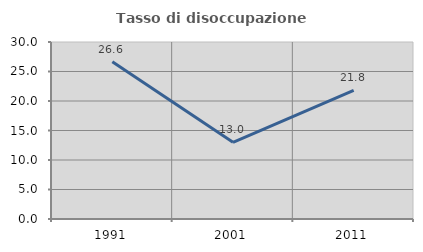
| Category | Tasso di disoccupazione giovanile  |
|---|---|
| 1991.0 | 26.634 |
| 2001.0 | 12.999 |
| 2011.0 | 21.797 |